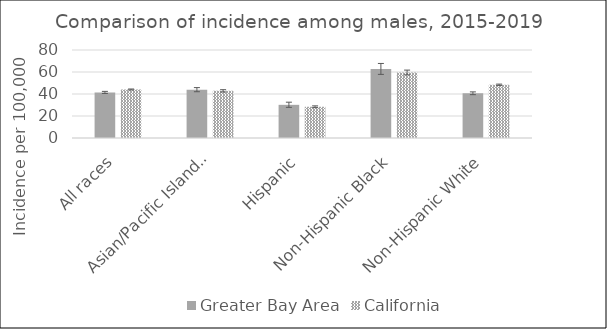
| Category | Greater Bay Area | California | SEER 18 |
|---|---|---|---|
| All races | 41.44 | 44.11 |  |
| Asian/Pacific Islander | 43.9 | 42.86 |  |
| Hispanic | 30.15 | 28.41 |  |
| Non-Hispanic Black | 62.65 | 59.54 |  |
| Non-Hispanic White | 40.64 | 48.4 |  |